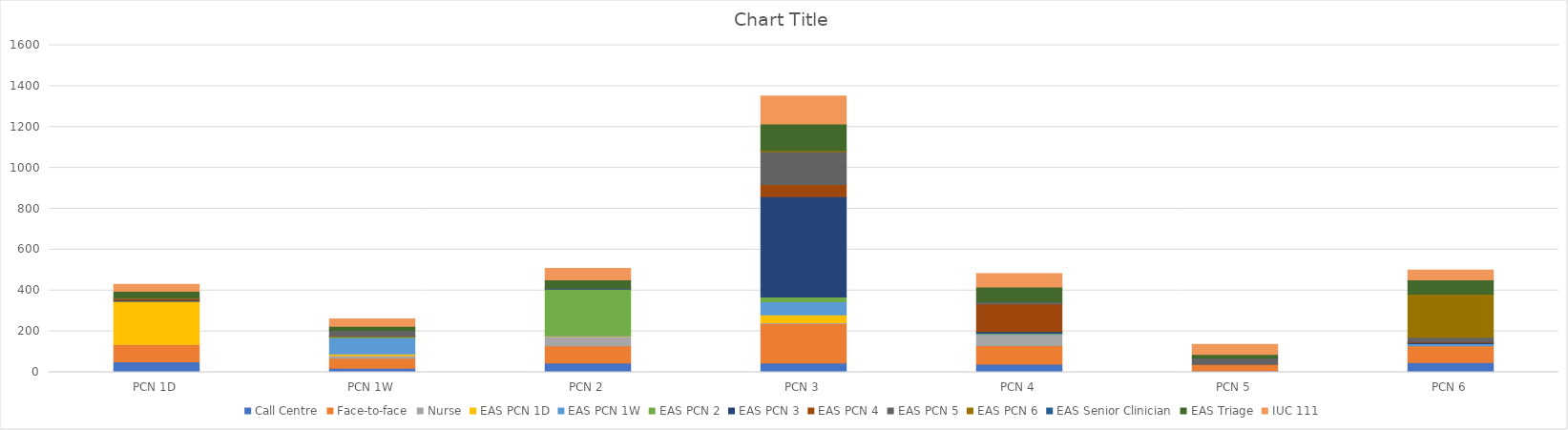
| Category | Call Centre | Face-to-face | Nurse | EAS PCN 1D | EAS PCN 1W | EAS PCN 2 | EAS PCN 3 | EAS PCN 4 | EAS PCN 5 | EAS PCN 6 | EAS Senior Clinician | EAS Triage | IUC 111 |
|---|---|---|---|---|---|---|---|---|---|---|---|---|---|
| PCN 1D | 51 | 85 | 1 | 210 | 0 | 0 | 6 | 6 | 3 | 3 | 0 | 31 | 34 |
| PCN 1W | 20 | 49 | 13 | 8 | 79 | 6 | 0 | 3 | 27 | 0 | 0 | 20 | 36 |
| PCN 2 | 46 | 84 | 45 | 3 | 3 | 226 | 3 | 0 | 3 | 0 | 0 | 39 | 57 |
| PCN 3 | 46 | 192 | 5 | 38 | 64 | 24 | 491 | 59 | 161 | 6 | 0 | 129 | 137 |
| PCN 4 | 40 | 91 | 54 | 0 | 3 | 3 | 9 | 135 | 10 | 0 | 0 | 73 | 65 |
| PCN 5 | 7 | 32 | 0 | 0 | 0 | 0 | 0 | 0 | 31 | 0 | 0 | 18 | 49 |
| PCN 6 | 48 | 82 | 0 | 0 | 10 | 0 | 6 | 3 | 23 | 210 | 0 | 70 | 48 |